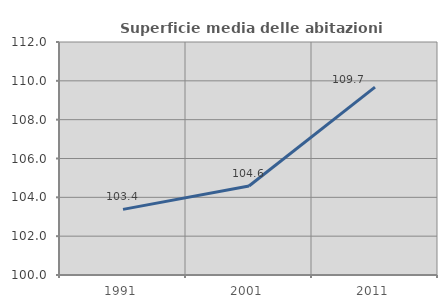
| Category | Superficie media delle abitazioni occupate |
|---|---|
| 1991.0 | 103.379 |
| 2001.0 | 104.586 |
| 2011.0 | 109.678 |